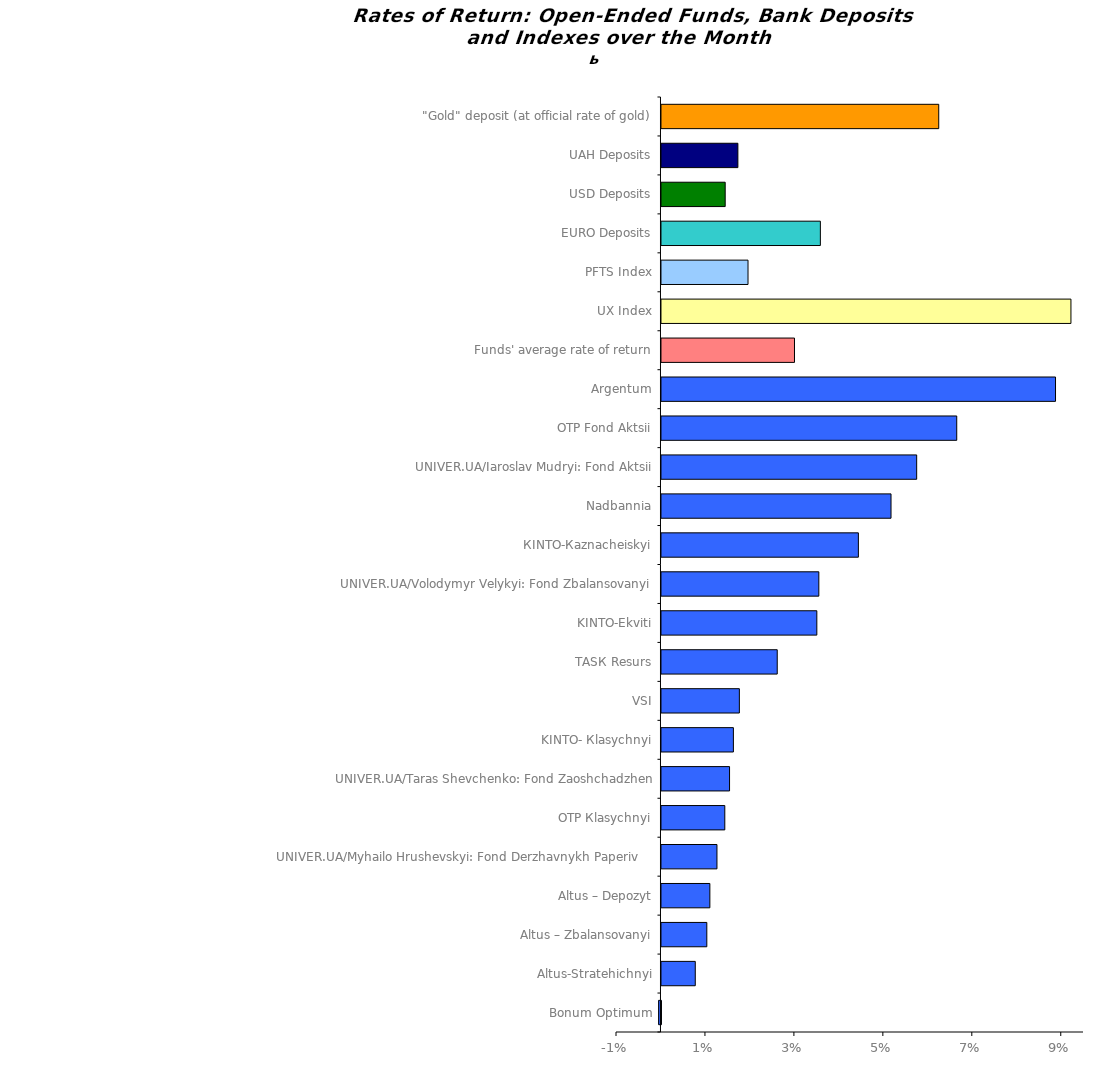
| Category | Series 0 |
|---|---|
| Bonum Optimum | -0.001 |
| Altus-Stratehichnyi | 0.008 |
| Altus – Zbalansovanyi | 0.01 |
| Altus – Depozyt | 0.011 |
| UNIVER.UA/Myhailo Hrushevskyi: Fond Derzhavnykh Paperiv    | 0.012 |
| ОТP Кlasychnyi | 0.014 |
| UNIVER.UA/Taras Shevchenko: Fond Zaoshchadzhen | 0.015 |
| KINTO- Кlasychnyi | 0.016 |
| VSI | 0.018 |
| ТАSК Resurs | 0.026 |
| KINTO-Ekviti | 0.035 |
| UNIVER.UA/Volodymyr Velykyi: Fond Zbalansovanyi | 0.035 |
| КІNTO-Каznacheiskyi | 0.044 |
| Nadbannia | 0.052 |
| UNIVER.UA/Iaroslav Mudryi: Fond Aktsii | 0.057 |
| ОТP Fond Aktsii | 0.066 |
| Аrgentum | 0.089 |
| Funds' average rate of return | 0.03 |
| UX Index | 0.092 |
| PFTS Index | 0.019 |
| EURO Deposits | 0.036 |
| USD Deposits | 0.014 |
| UAH Deposits | 0.017 |
| "Gold" deposit (at official rate of gold) | 0.062 |